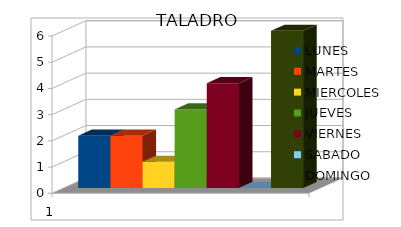
| Category | LUNES | MARTES | MIERCOLES | JUEVES  | VIERNES  | SABADO | DOMINGO |
|---|---|---|---|---|---|---|---|
| 0 | 2 | 2 | 1 | 3 | 4 | 0 | 6 |